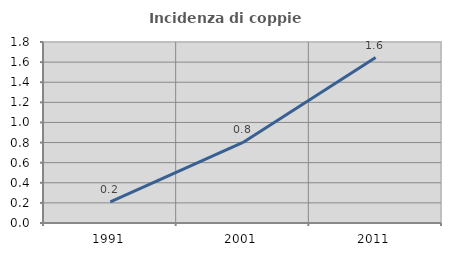
| Category | Incidenza di coppie miste |
|---|---|
| 1991.0 | 0.209 |
| 2001.0 | 0.801 |
| 2011.0 | 1.645 |